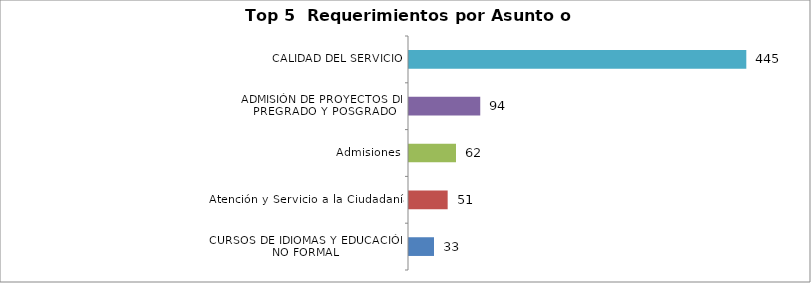
| Category | Total |
|---|---|
| CURSOS DE IDIOMAS Y EDUCACIÓN NO FORMAL | 33 |
| Atención y Servicio a la Ciudadanía | 51 |
| Admisiones | 62 |
| ADMISIÓN DE PROYECTOS DE PREGRADO Y POSGRADO | 94 |
| CALIDAD DEL SERVICIO | 445 |